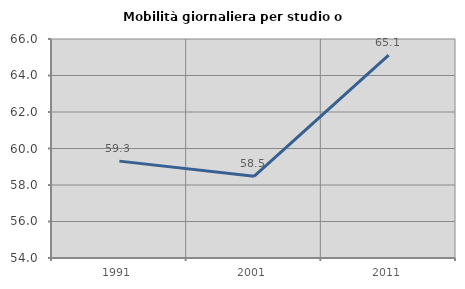
| Category | Mobilità giornaliera per studio o lavoro |
|---|---|
| 1991.0 | 59.309 |
| 2001.0 | 58.475 |
| 2011.0 | 65.115 |